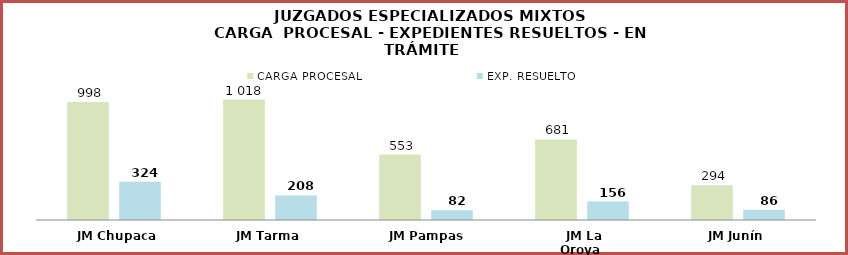
| Category | CARGA PROCESAL | EXP. RESUELTO |
|---|---|---|
| JM Chupaca | 998 | 324 |
| JM Tarma | 1018 | 208 |
| JM Pampas | 553 | 82 |
| JM La Oroya | 681 | 156 |
| JM Junín | 294 | 86 |